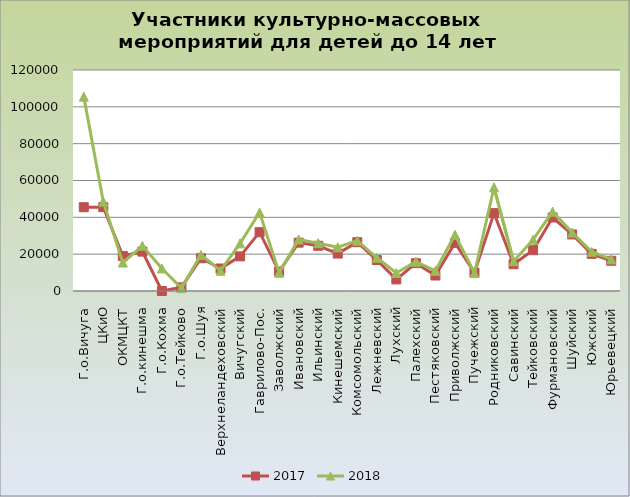
| Category | 2017 | 2018 |
|---|---|---|
| Г.о.Вичуга | 45490 | 105531 |
| ЦКиО | 45536 | 48498 |
| ОКМЦКТ | 18990 | 15441 |
| Г.о.кинешма | 21395 | 24520 |
| Г.о.Кохма | 0 | 12250 |
| Г.о.Тейково | 1990 | 1590 |
| Г.о.Шуя | 17769 | 19614 |
| Верхнеландеховский | 12206 | 11022 |
| Вичугский | 18807 | 25871 |
| Гаврилово-Пос. | 31939 | 42676 |
| Заволжский | 10562 | 9889 |
| Ивановский | 26257 | 27978 |
| Ильинский | 24548 | 25978 |
| Кинешемский | 20323 | 23743 |
| Комсомольский | 26514 | 27328 |
| Лежневский | 16801 | 18044 |
| Лухский | 6293 | 9809 |
| Палехский | 15110 | 15885 |
| Пестяковский | 8415 | 10981 |
| Приволжский | 26105 | 30560 |
| Пучежский | 9952 | 9747 |
| Родниковский | 42279 | 56315 |
| Савинский | 14541 | 16157 |
| Тейковский | 22163 | 27864 |
| Фурмановский | 39913 | 43092 |
| Шуйский | 30712 | 31711 |
| Южский | 20171 | 21306 |
| Юрьевецкий | 16408 | 17180 |